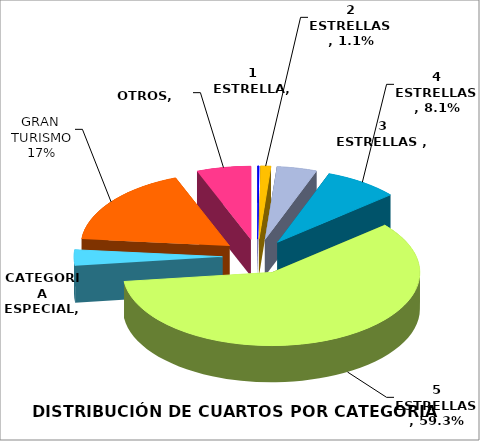
| Category | CATEGORIA  |
|---|---|
| 1 ESTRELLA | 0.002 |
| 2 ESTRELLAS | 0.011 |
| 3 ESTRELLAS  | 0.044 |
| 4 ESTRELLAS | 0.081 |
| 5 ESTRELLAS | 0.593 |
| CATEGORIA ESPECIAL | 0.035 |
| GRAN TURISMO | 0.176 |
| OTROS | 0.059 |